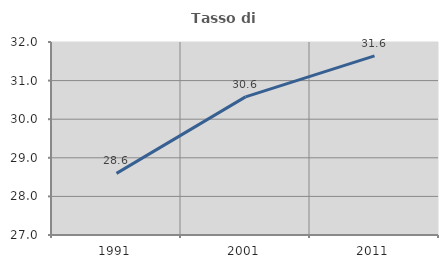
| Category | Tasso di occupazione   |
|---|---|
| 1991.0 | 28.597 |
| 2001.0 | 30.579 |
| 2011.0 | 31.642 |